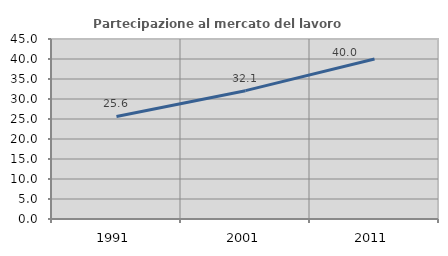
| Category | Partecipazione al mercato del lavoro  femminile |
|---|---|
| 1991.0 | 25.63 |
| 2001.0 | 32.083 |
| 2011.0 | 40 |